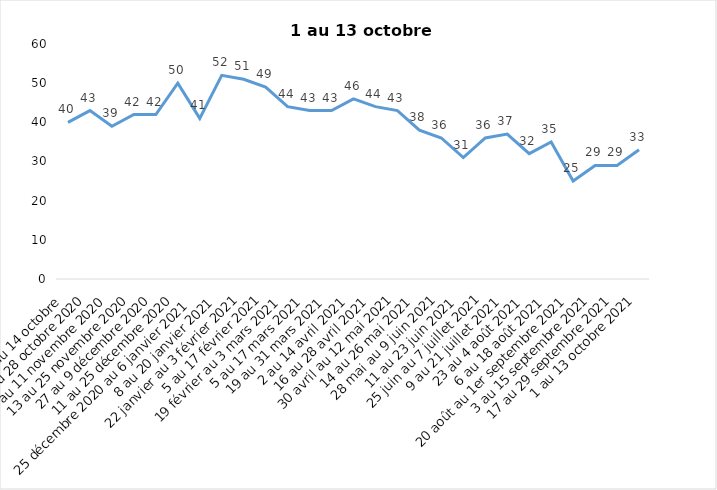
| Category | Toujours aux trois mesures |
|---|---|
| 2 au 14 octobre  | 40 |
| 16 au 28 octobre 2020 | 43 |
| 30 octobre au 11 novembre 2020 | 39 |
| 13 au 25 novembre 2020 | 42 |
| 27 au 9 décembre 2020 | 42 |
| 11 au 25 décembre 2020 | 50 |
| 25 décembre 2020 au 6 janvier 2021 | 41 |
| 8 au 20 janvier 2021 | 52 |
| 22 janvier au 3 février 2021 | 51 |
| 5 au 17 février 2021 | 49 |
| 19 février au 3 mars 2021 | 44 |
| 5 au 17 mars 2021 | 43 |
| 19 au 31 mars 2021 | 43 |
| 2 au 14 avril 2021 | 46 |
| 16 au 28 avril 2021 | 44 |
| 30 avril au 12 mai 2021 | 43 |
| 14 au 26 mai 2021 | 38 |
| 28 mai au 9 juin 2021 | 36 |
| 11 au 23 juin 2021 | 31 |
| 25 juin au 7 juillet 2021 | 36 |
| 9 au 21 juillet 2021 | 37 |
| 23 au 4 août 2021 | 32 |
| 6 au 18 août 2021 | 35 |
| 20 août au 1er septembre 2021 | 25 |
| 3 au 15 septembre 2021 | 29 |
| 17 au 29 septembre 2021 | 29 |
| 1 au 13 octobre 2021 | 33 |